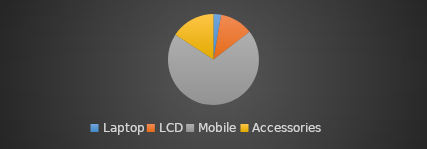
| Category | Total |
|---|---|
| Laptop | 750 |
| LCD | 3284 |
| Mobile | 19232 |
| Accessories | 4373 |